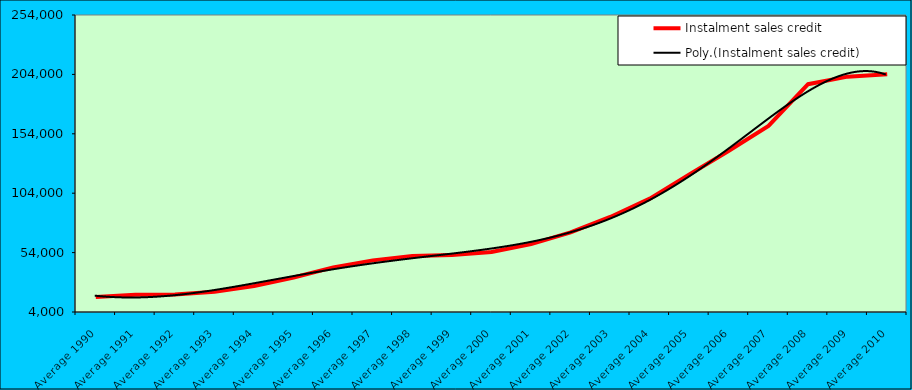
| Category | Instalment sales credit |
|---|---|
| Average 1990 | 16662.083 |
| Average 1991 | 18433.083 |
| Average 1992 | 18768.5 |
| Average 1993 | 20959.083 |
| Average 1994 | 25954 |
| Average 1995 | 33013.417 |
| Average 1996 | 41532.333 |
| Average 1997 | 47453.833 |
| Average 1998 | 51143.5 |
| Average 1999 | 51879.091 |
| Average 2000 | 54488.667 |
| Average 2001 | 61161.364 |
| Average 2002 | 70966.333 |
| Average 2003 | 84007.167 |
| Average 2004 | 99388 |
| Average 2005 | 119700.667 |
| Average 2006 | 139721.667 |
| Average 2007 | 160597.833 |
| Average 2008 | 195741.083 |
| Average 2009 | 202100.667 |
| Average 2010 | 204068.286 |